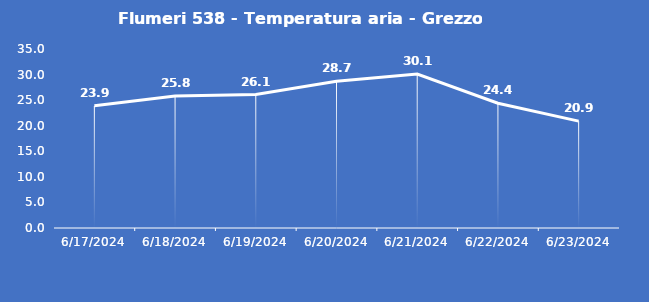
| Category | Flumeri 538 - Temperatura aria - Grezzo (°C) |
|---|---|
| 6/17/24 | 23.9 |
| 6/18/24 | 25.8 |
| 6/19/24 | 26.1 |
| 6/20/24 | 28.7 |
| 6/21/24 | 30.1 |
| 6/22/24 | 24.4 |
| 6/23/24 | 20.9 |